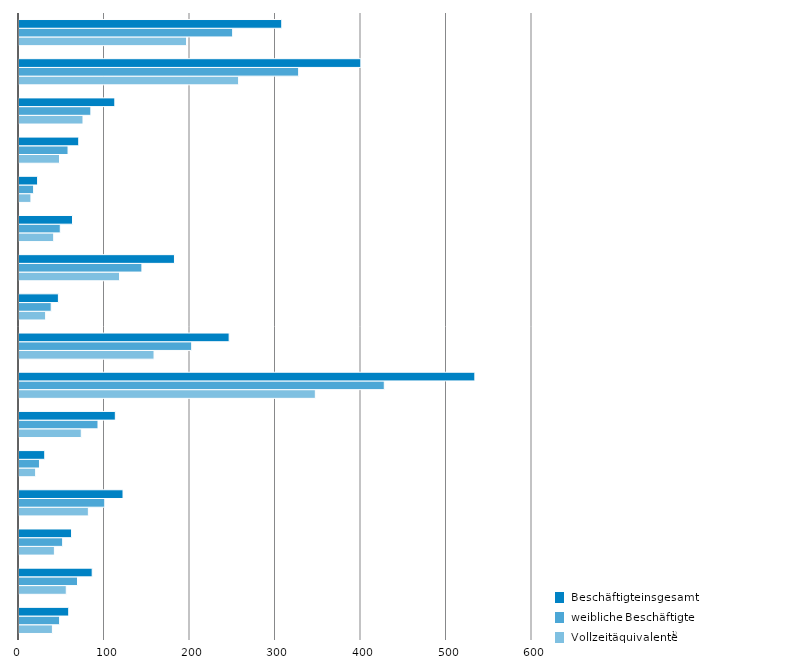
| Category | VZÄ | wB | iB |
|---|---|---|---|
| 0 | 39.086 | 47.493 | 58.156 |
| 1 | 55.294 | 68.444 | 85.612 |
| 2 | 41.398 | 51.048 | 61.478 |
| 3 | 81.128 | 100.318 | 121.665 |
| 4 | 19.457 | 23.957 | 30.134 |
| 5 | 72.831 | 92.395 | 112.667 |
| 6 | 346.589 | 427.247 | 533.157 |
| 7 | 157.933 | 201.987 | 245.794 |
| 8 | 31.139 | 37.65 | 46.08 |
| 9 | 117.583 | 143.747 | 181.818 |
| 10 | 40.581 | 48.269 | 62.594 |
| 11 | 13.945 | 17.088 | 21.763 |
| 12 | 47.37 | 57.352 | 69.881 |
| 13 | 74.851 | 84.046 | 112.062 |
| 14 | 256.847 | 327.077 | 399.809 |
| 15 | 195.966 | 249.883 | 307.328 |